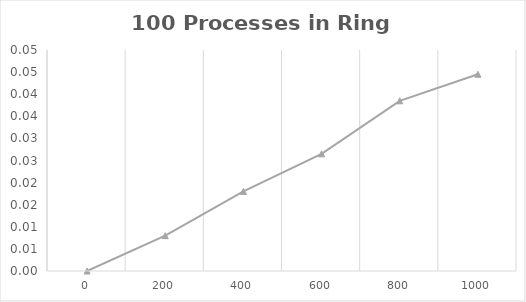
| Category | 100 |
|---|---|
| 0.0 | 0 |
| 200.0 | 0.008 |
| 400.0 | 0.018 |
| 600.0 | 0.027 |
| 800.0 | 0.039 |
| 1000.0 | 0.045 |